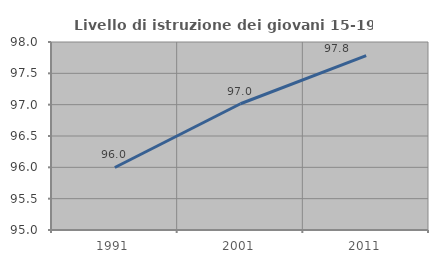
| Category | Livello di istruzione dei giovani 15-19 anni |
|---|---|
| 1991.0 | 95.998 |
| 2001.0 | 97.015 |
| 2011.0 | 97.783 |